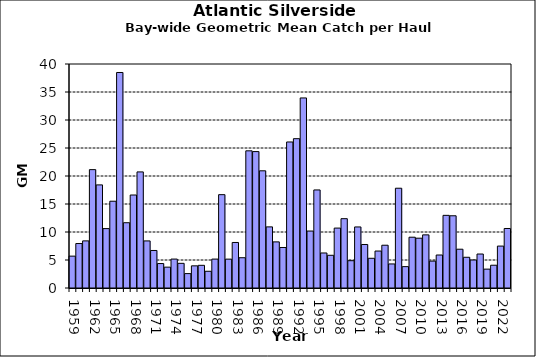
| Category | Series 0 |
|---|---|
| 1959.0 | 5.691 |
| 1960.0 | 7.939 |
| 1961.0 | 8.413 |
| 1962.0 | 21.137 |
| 1963.0 | 18.412 |
| 1964.0 | 10.607 |
| 1965.0 | 15.494 |
| 1966.0 | 38.484 |
| 1967.0 | 11.657 |
| 1968.0 | 16.606 |
| 1969.0 | 20.729 |
| 1970.0 | 8.407 |
| 1971.0 | 6.7 |
| 1972.0 | 4.365 |
| 1973.0 | 3.723 |
| 1974.0 | 5.166 |
| 1975.0 | 4.403 |
| 1976.0 | 2.571 |
| 1977.0 | 3.959 |
| 1978.0 | 4.049 |
| 1979.0 | 2.986 |
| 1980.0 | 5.163 |
| 1981.0 | 16.668 |
| 1982.0 | 5.154 |
| 1983.0 | 8.128 |
| 1984.0 | 5.406 |
| 1985.0 | 24.496 |
| 1986.0 | 24.359 |
| 1987.0 | 20.927 |
| 1988.0 | 10.915 |
| 1989.0 | 8.235 |
| 1990.0 | 7.235 |
| 1991.0 | 26.076 |
| 1992.0 | 26.664 |
| 1993.0 | 33.939 |
| 1994.0 | 10.17 |
| 1995.0 | 17.509 |
| 1996.0 | 6.254 |
| 1997.0 | 5.841 |
| 1998.0 | 10.698 |
| 1999.0 | 12.379 |
| 2000.0 | 4.875 |
| 2001.0 | 10.902 |
| 2002.0 | 7.769 |
| 2003.0 | 5.306 |
| 2004.0 | 6.6 |
| 2005.0 | 7.638 |
| 2006.0 | 4.297 |
| 2007.0 | 17.816 |
| 2008.0 | 3.814 |
| 2009.0 | 9.07 |
| 2010.0 | 8.895 |
| 2011.0 | 9.488 |
| 2012.0 | 4.803 |
| 2013.0 | 5.893 |
| 2014.0 | 12.972 |
| 2015.0 | 12.897 |
| 2016.0 | 6.927 |
| 2017.0 | 5.487 |
| 2018.0 | 5.001 |
| 2019.0 | 6.067 |
| 2020.0 | 3.37 |
| 2021.0 | 4.068 |
| 2022.0 | 7.485 |
| 2023.0 | 10.627 |